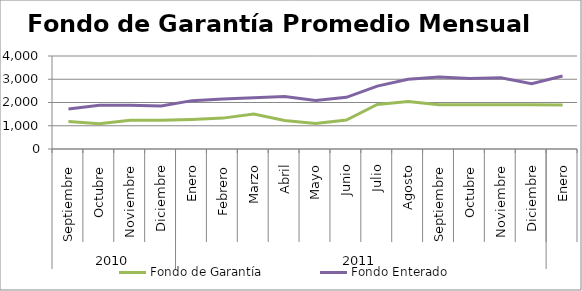
| Category | Fondo de Garantía | Fondo Enterado |
|---|---|---|
| 0 | 1186.765 | 1723.136 |
| 1 | 1091.277 | 1878.561 |
| 2 | 1240.142 | 1886.493 |
| 3 | 1233.184 | 1848.941 |
| 4 | 1267.175 | 2079.773 |
| 5 | 1328.315 | 2151.804 |
| 6 | 1507.218 | 2200.488 |
| 7 | 1222.61 | 2253.818 |
| 8 | 1097.438 | 2081.441 |
| 9 | 1248.758 | 2223.666 |
| 10 | 1917.982 | 2706.525 |
| 11 | 2038.339 | 3002.384 |
| 12 | 1900.513 | 3095.395 |
| 13 | 1900.513 | 3029.373 |
| 14 | 1900.513 | 3060.179 |
| 15 | 1900.513 | 2809.042 |
| 16 | 1896.798 | 3141.641 |